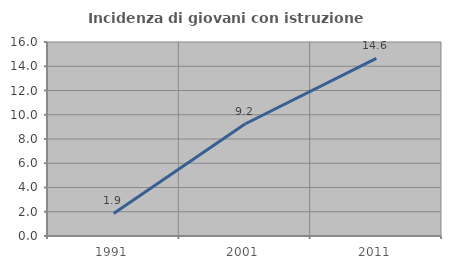
| Category | Incidenza di giovani con istruzione universitaria |
|---|---|
| 1991.0 | 1.858 |
| 2001.0 | 9.238 |
| 2011.0 | 14.646 |